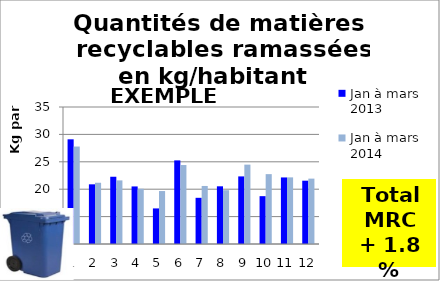
| Category | Jan à mars 
2013 | Jan à mars 
2014 |
|---|---|---|
| 0 | 29.103 | 27.786 |
| 1 | 20.889 | 21.177 |
| 2 | 22.271 | 21.609 |
| 3 | 20.504 | 20.076 |
| 4 | 16.493 | 19.663 |
| 5 | 25.258 | 24.41 |
| 6 | 18.428 | 20.591 |
| 7 | 20.528 | 19.821 |
| 8 | 22.335 | 24.484 |
| 9 | 18.73 | 22.75 |
| 10 | 22.145 | 22.158 |
| 11 | 21.552 | 21.93 |